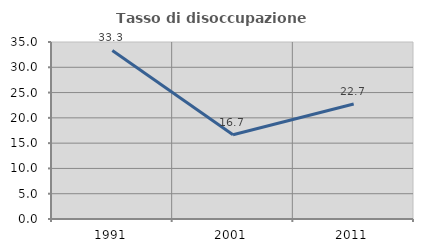
| Category | Tasso di disoccupazione giovanile  |
|---|---|
| 1991.0 | 33.333 |
| 2001.0 | 16.667 |
| 2011.0 | 22.727 |